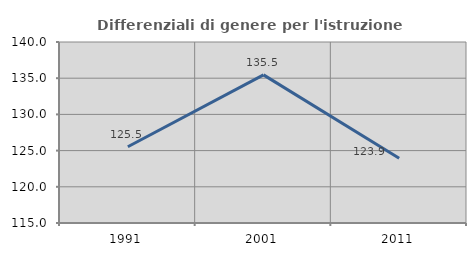
| Category | Differenziali di genere per l'istruzione superiore |
|---|---|
| 1991.0 | 125.532 |
| 2001.0 | 135.459 |
| 2011.0 | 123.94 |